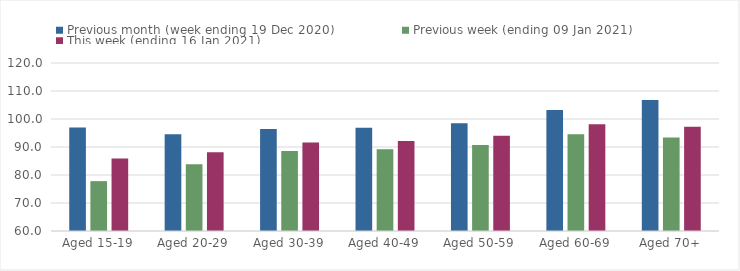
| Category | Previous month (week ending 19 Dec 2020) | Previous week (ending 09 Jan 2021) | This week (ending 16 Jan 2021) |
|---|---|---|---|
| Aged 15-19 | 96.96 | 77.81 | 85.85 |
| Aged 20-29 | 94.52 | 83.85 | 88.15 |
| Aged 30-39 | 96.4 | 88.54 | 91.57 |
| Aged 40-49 | 96.86 | 89.22 | 92.16 |
| Aged 50-59 | 98.48 | 90.7 | 94.06 |
| Aged 60-69 | 103.2 | 94.54 | 98.14 |
| Aged 70+ | 106.82 | 93.38 | 97.23 |